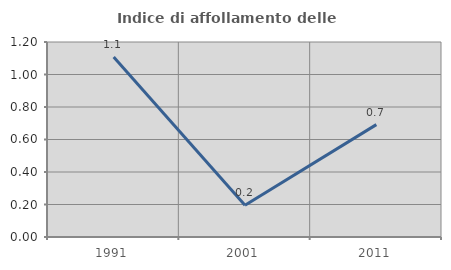
| Category | Indice di affollamento delle abitazioni  |
|---|---|
| 1991.0 | 1.107 |
| 2001.0 | 0.196 |
| 2011.0 | 0.692 |